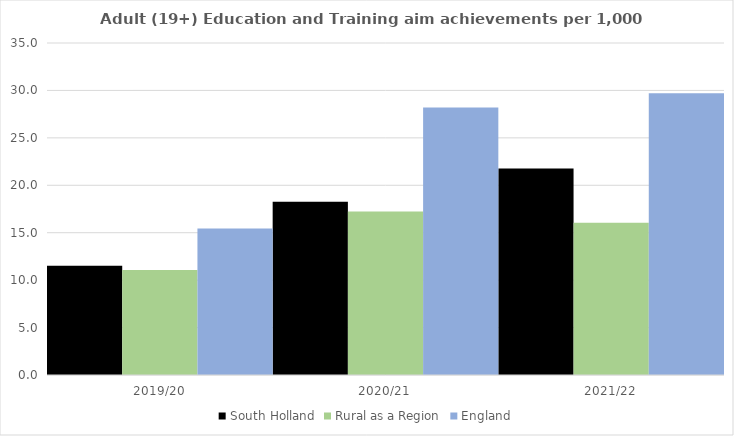
| Category | South Holland | Rural as a Region | England |
|---|---|---|---|
| 2019/20 | 11.525 | 11.081 | 15.446 |
| 2020/21 | 18.259 | 17.224 | 28.211 |
| 2021/22 | 21.762 | 16.063 | 29.711 |